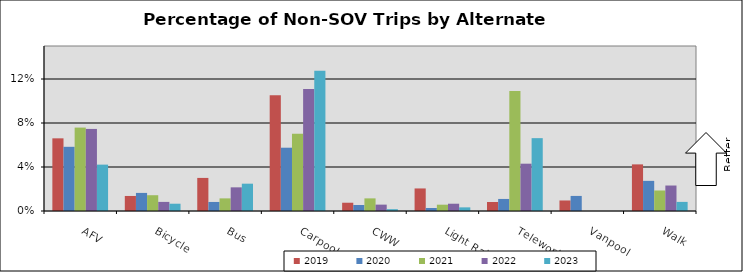
| Category | 2019 | 2020 | 2021 | 2022 | 2023 |
|---|---|---|---|---|---|
| AFV | 0.066 | 0.058 | 0.076 | 0.075 | 0.042 |
| Bicycle | 0.014 | 0.016 | 0.014 | 0.008 | 0.007 |
| Bus | 0.03 | 0.008 | 0.011 | 0.022 | 0.025 |
| Carpool | 0.105 | 0.058 | 0.07 | 0.111 | 0.127 |
| CWW | 0.008 | 0.005 | 0.011 | 0.006 | 0.002 |
| Light Rail | 0.021 | 0.003 | 0.006 | 0.007 | 0.003 |
| Telework | 0.008 | 0.011 | 0.109 | 0.043 | 0.066 |
| Vanpool | 0.01 | 0.014 | 0 | 0 | 0 |
| Walk | 0.042 | 0.027 | 0.019 | 0.023 | 0.008 |